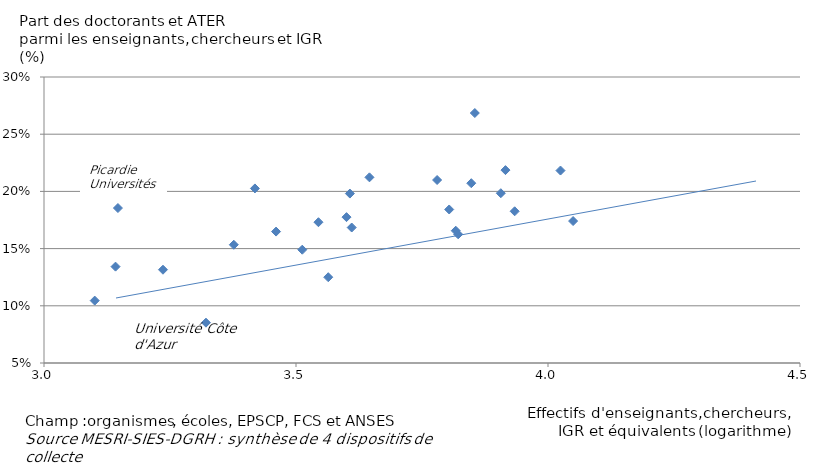
| Category | Series 0 |
|---|---|
| 3.6457169393696036 | 0.212 |
| 3.8477576883923312 | 0.207 |
| 3.376576957056512 | 0.153 |
| 3.6105537053170944 | 0.168 |
| 3.1419480637695183 | 0.134 |
| 3.23605332293153 | 0.132 |
| 3.8040030547296126 | 0.184 |
| 3.779957051246906 | 0.21 |
| 3.8217754671834636 | 0.162 |
| 3.8169389257746906 | 0.166 |
| 3.600210306409328 | 0.178 |
| 3.5639815408467146 | 0.125 |
| 3.9339001268762064 | 0.183 |
| 3.906343662949931 | 0.198 |
| 3.321343619336632 | 0.085 |
| 4.049816316333931 | 0.174 |
| 3.4604467838807205 | 0.165 |
| 3.5124615897539933 | 0.149 |
| 3.8547916940539855 | 0.269 |
| 3.606918525948291 | 0.198 |
| 4.024791782553678 | 0.218 |
| 3.5445715339817223 | 0.173 |
| 3.4184670209466006 | 0.203 |
| 3.1467139378337765 | 0.185 |
| 3.915610862661467 | 0.219 |
| 3.1006565338062138 | 0.105 |